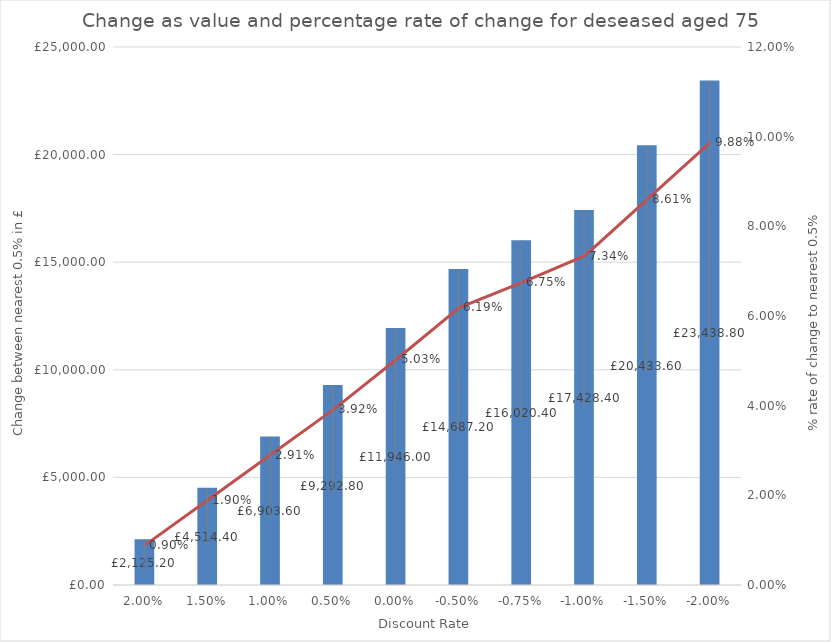
| Category | Value change |
|---|---|
| 0.02 | 2125.2 |
| 0.015 | 4514.4 |
| 0.01 | 6903.6 |
| 0.005 | 9292.8 |
| 0.0 | 11946 |
| -0.005 | 14687.2 |
| -0.0075 | 16020.4 |
| -0.01 | 17428.4 |
| -0.015 | 20433.6 |
| -0.02 | 23438.8 |